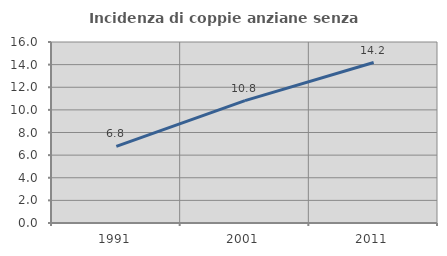
| Category | Incidenza di coppie anziane senza figli  |
|---|---|
| 1991.0 | 6.77 |
| 2001.0 | 10.816 |
| 2011.0 | 14.183 |